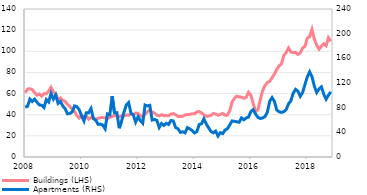
| Category | Buildings (LHS) |
|---|---|
| 2008-01-01 | 60.827 |
| 2008-02-01 | 64.213 |
| 2008-03-01 | 64.63 |
| 2008-04-01 | 63.749 |
| 2008-05-01 | 60.985 |
| 2008-06-01 | 58.452 |
| 2008-07-01 | 59.692 |
| 2008-08-01 | 57.551 |
| 2008-09-01 | 59.847 |
| 2008-10-01 | 59.735 |
| 2008-11-01 | 62.529 |
| 2008-12-01 | 65.906 |
| 2009-01-01 | 61.27 |
| 2009-02-01 | 59.826 |
| 2009-03-01 | 53.757 |
| 2009-04-01 | 55.875 |
| 2009-05-01 | 53.679 |
| 2009-06-01 | 52.539 |
| 2009-07-01 | 49.752 |
| 2009-08-01 | 47.793 |
| 2009-09-01 | 45.103 |
| 2009-10-01 | 43.137 |
| 2009-11-01 | 39.04 |
| 2009-12-01 | 36.799 |
| 2010-01-01 | 39.529 |
| 2010-02-01 | 38.148 |
| 2010-03-01 | 38.701 |
| 2010-04-01 | 35.68 |
| 2010-05-01 | 37.346 |
| 2010-06-01 | 36.717 |
| 2010-07-01 | 35.681 |
| 2010-08-01 | 36.539 |
| 2010-09-01 | 37.238 |
| 2010-10-01 | 37.284 |
| 2010-11-01 | 37.111 |
| 2010-12-01 | 36.144 |
| 2011-01-01 | 37.407 |
| 2011-02-01 | 38.34 |
| 2011-03-01 | 39.196 |
| 2011-04-01 | 38.85 |
| 2011-05-01 | 38.212 |
| 2011-06-01 | 38.927 |
| 2011-07-01 | 38.708 |
| 2011-08-01 | 39.656 |
| 2011-09-01 | 39.599 |
| 2011-10-01 | 40.677 |
| 2011-11-01 | 40.124 |
| 2011-12-01 | 41.542 |
| 2012-01-01 | 41.295 |
| 2012-02-01 | 39.201 |
| 2012-03-01 | 37.735 |
| 2012-04-01 | 40.514 |
| 2012-05-01 | 42.807 |
| 2012-06-01 | 44.507 |
| 2012-07-01 | 42.45 |
| 2012-08-01 | 41.701 |
| 2012-09-01 | 39.553 |
| 2012-10-01 | 38.913 |
| 2012-11-01 | 40.056 |
| 2012-12-01 | 39.134 |
| 2013-01-01 | 39.165 |
| 2013-02-01 | 38.957 |
| 2013-03-01 | 40.623 |
| 2013-04-01 | 41.062 |
| 2013-05-01 | 39.968 |
| 2013-06-01 | 38.256 |
| 2013-07-01 | 38.298 |
| 2013-08-01 | 38.575 |
| 2013-09-01 | 39.757 |
| 2013-10-01 | 40.175 |
| 2013-11-01 | 40.227 |
| 2013-12-01 | 40.945 |
| 2014-01-01 | 40.898 |
| 2014-02-01 | 42.645 |
| 2014-03-01 | 42.996 |
| 2014-04-01 | 41.811 |
| 2014-05-01 | 40.075 |
| 2014-06-01 | 38.472 |
| 2014-07-01 | 38.692 |
| 2014-08-01 | 39.353 |
| 2014-09-01 | 41.169 |
| 2014-10-01 | 40.621 |
| 2014-11-01 | 39.514 |
| 2014-12-01 | 40.266 |
| 2015-01-01 | 41.249 |
| 2015-02-01 | 39.41 |
| 2015-03-01 | 39.548 |
| 2015-04-01 | 43.663 |
| 2015-05-01 | 51.971 |
| 2015-06-01 | 55.475 |
| 2015-07-01 | 57.568 |
| 2015-08-01 | 56.885 |
| 2015-09-01 | 56.555 |
| 2015-10-01 | 55.554 |
| 2015-11-01 | 56.273 |
| 2015-12-01 | 61.196 |
| 2016-01-01 | 58.484 |
| 2016-02-01 | 50.29 |
| 2016-03-01 | 43.223 |
| 2016-04-01 | 44.551 |
| 2016-05-01 | 54.341 |
| 2016-06-01 | 62.79 |
| 2016-07-01 | 67.634 |
| 2016-08-01 | 70.483 |
| 2016-09-01 | 71.506 |
| 2016-10-01 | 74.925 |
| 2016-11-01 | 78.613 |
| 2016-12-01 | 82.751 |
| 2017-01-01 | 86.185 |
| 2017-02-01 | 88.058 |
| 2017-03-01 | 96.059 |
| 2017-04-01 | 98.784 |
| 2017-05-01 | 103.155 |
| 2017-06-01 | 99.273 |
| 2017-07-01 | 98.74 |
| 2017-08-01 | 99.081 |
| 2017-09-01 | 96.947 |
| 2017-10-01 | 98.424 |
| 2017-11-01 | 103.118 |
| 2017-12-01 | 104.591 |
| 2018-01-01 | 112.587 |
| 2018-02-01 | 113.772 |
| 2018-03-01 | 120.754 |
| 2018-04-01 | 111.42 |
| 2018-05-01 | 105.766 |
| 2018-06-01 | 101.943 |
| 2018-07-01 | 104.773 |
| 2018-08-01 | 107.137 |
| 2018-09-30 | 105.267 |
| 2018-10-31 | 112.84 |
| 2018-11-30 | 109.439 |